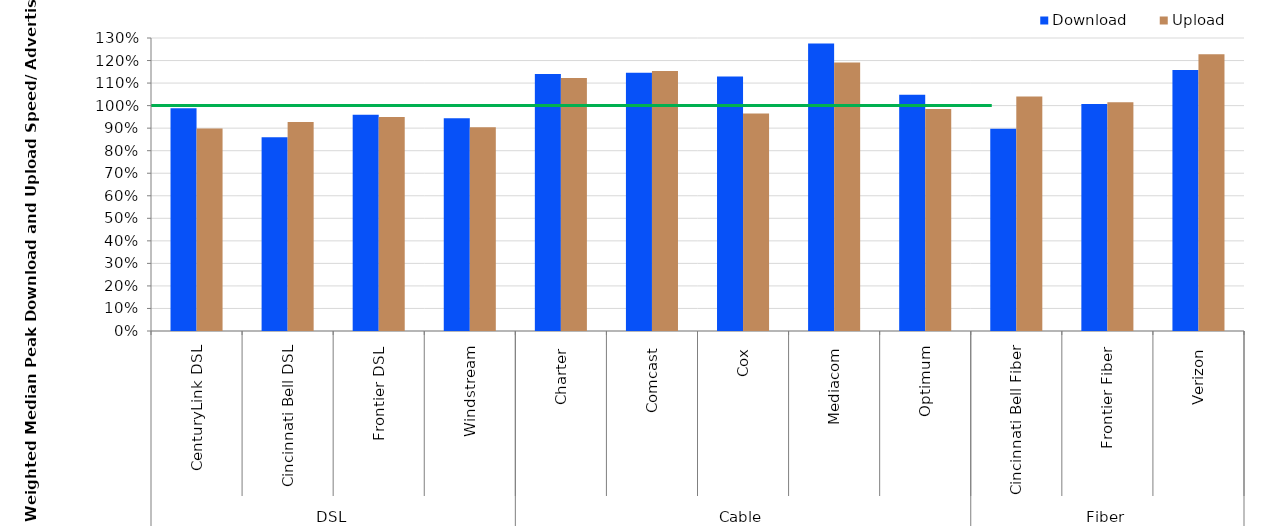
| Category | Download | Upload |
|---|---|---|
| 0 | 0.988 | 0.899 |
| 1 | 0.859 | 0.927 |
| 2 | 0.959 | 0.95 |
| 3 | 0.944 | 0.904 |
| 4 | 1.14 | 1.122 |
| 5 | 1.145 | 1.153 |
| 6 | 1.129 | 0.965 |
| 7 | 1.275 | 1.191 |
| 8 | 1.048 | 0.985 |
| 9 | 0.898 | 1.04 |
| 10 | 1.007 | 1.014 |
| 11 | 1.158 | 1.228 |